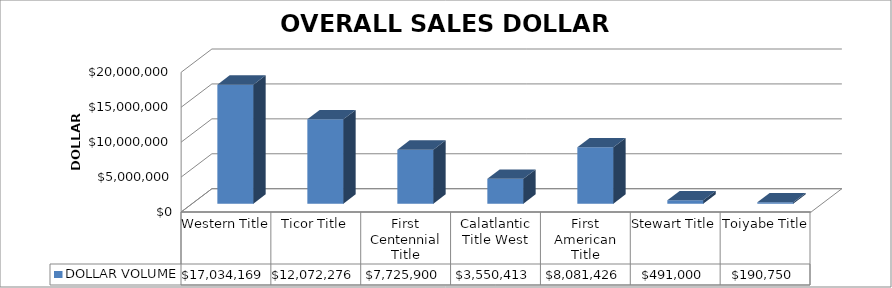
| Category | DOLLAR VOLUME |
|---|---|
| Western Title | 17034169.12 |
| Ticor Title | 12072276 |
| First Centennial Title | 7725900 |
| Calatlantic Title West | 3550413 |
| First American Title | 8081426 |
| Stewart Title | 491000 |
| Toiyabe Title | 190750 |